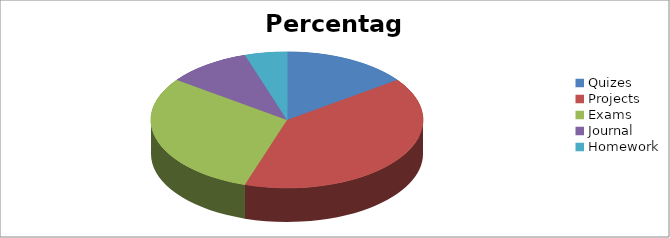
| Category | Percentage |
|---|---|
| Quizes | 15 |
| Projects | 40 |
| Exams | 30 |
| Journal | 10 |
| Homework | 5 |